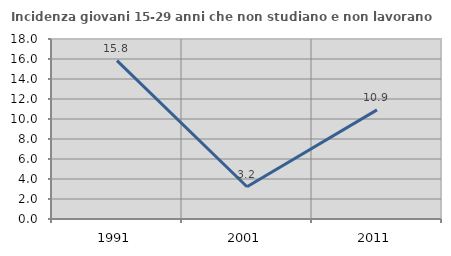
| Category | Incidenza giovani 15-29 anni che non studiano e non lavorano  |
|---|---|
| 1991.0 | 15.845 |
| 2001.0 | 3.226 |
| 2011.0 | 10.909 |